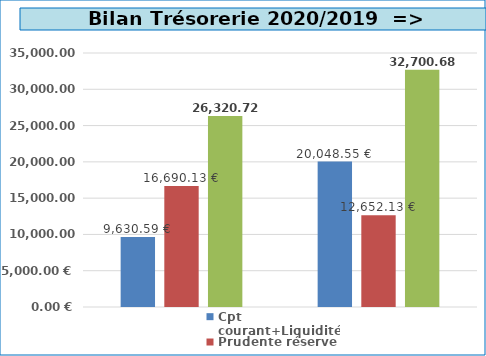
| Category | Cpt courant+Liquidité | Prudente réserve | TOTAL |
|---|---|---|---|
| 0 | 9630.59 | 16690.13 | 26320.72 |
| 1 | 20048.55 | 12652.13 | 32700.68 |